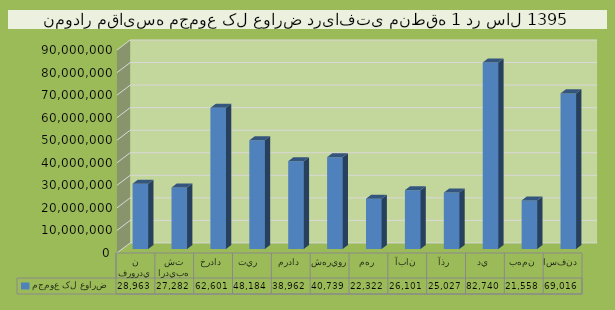
| Category | مجموع کل عوارض  |
|---|---|
| فروردين | 28963214 |
| ارديبهشت | 27282976 |
| خرداد | 62601834 |
| تير  | 48184238 |
| مرداد | 38962947 |
| شهريور | 40739133 |
| مهر | 22322605 |
| آبان | 26101424 |
| آذر | 25027538 |
| دي | 82740600 |
| بهمن | 21558114 |
| اسفند | 69016229 |